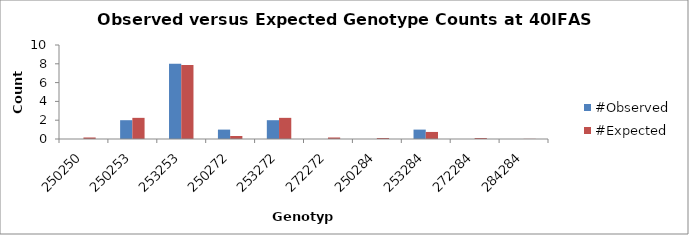
| Category | #Observed | #Expected |
|---|---|---|
| 250250.0 | 0 | 0.161 |
| 250253.0 | 2 | 2.25 |
| 253253.0 | 8 | 7.875 |
| 250272.0 | 1 | 0.321 |
| 253272.0 | 2 | 2.25 |
| 272272.0 | 0 | 0.161 |
| 250284.0 | 0 | 0.107 |
| 253284.0 | 1 | 0.75 |
| 272284.0 | 0 | 0.107 |
| 284284.0 | 0 | 0.018 |